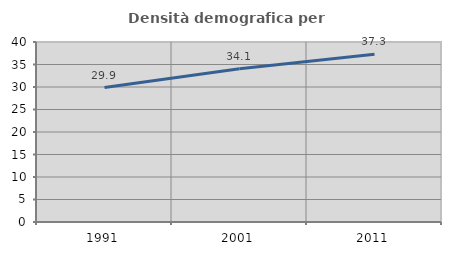
| Category | Densità demografica |
|---|---|
| 1991.0 | 29.877 |
| 2001.0 | 34.08 |
| 2011.0 | 37.27 |